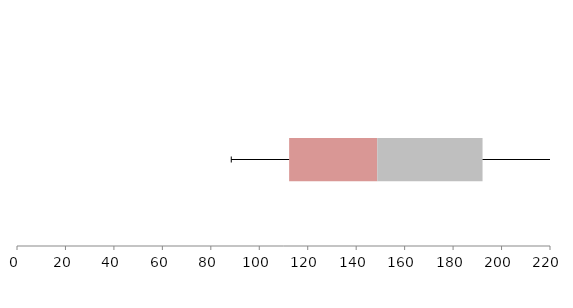
| Category | Series 1 | Series 2 | Series 3 |
|---|---|---|---|
| 0 | 112.326 | 36.381 | 43.451 |